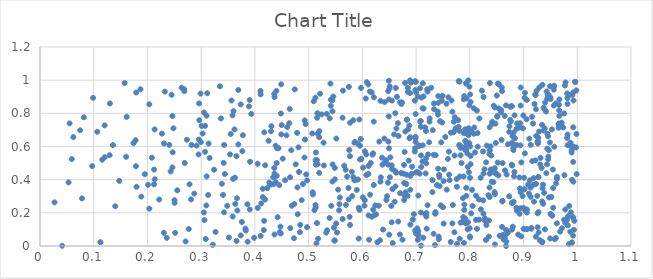
| Category | Series 0 |
|---|---|
| 0.725001586988589 | 0.75 |
| 0.5095330383467418 | 0.873 |
| 0.7491788354854625 | 0.906 |
| 0.9134312972160937 | 0.61 |
| 0.9310733424665492 | 0.492 |
| 0.6560143534649919 | 0.343 |
| 0.7190368506950143 | 0.498 |
| 0.9845870090882262 | 0.911 |
| 0.6255931763452097 | 0.191 |
| 0.6673933461414293 | 0.663 |
| 0.3890036401825033 | 0.842 |
| 0.6200912360928926 | 0.219 |
| 0.9921547678688489 | 0.062 |
| 0.8346472091099474 | 0.307 |
| 0.5662466689041356 | 0.484 |
| 0.6800089196566471 | 0.69 |
| 0.5528158931915826 | 0.082 |
| 0.8005545108075353 | 0.052 |
| 0.9518390606133226 | 0.296 |
| 0.7310391127308724 | 0.699 |
| 0.6111034641791904 | 0.974 |
| 0.9665549706235409 | 0.785 |
| 0.5956875371962214 | 0.522 |
| 0.6062852824526372 | 0.889 |
| 0.8415611706544808 | 0.749 |
| 0.8945519705392241 | 0.847 |
| 0.4267641198110218 | 0.382 |
| 0.678710162588666 | 0.567 |
| 0.7971405302204978 | 0.999 |
| 0.7438169328280968 | 0.361 |
| 0.7958289857257108 | 0.1 |
| 0.6173149417500813 | 0.926 |
| 0.8205073022126326 | 0.221 |
| 0.6982154945142347 | 0.994 |
| 0.943731275735242 | 0.493 |
| 0.7514206920747312 | 0.135 |
| 0.6039256323105225 | 0.243 |
| 0.8733132752875881 | 0.688 |
| 0.6633946385659116 | 0.709 |
| 0.9458343813561789 | 0.523 |
| 0.981980027722871 | 0.672 |
| 0.8533211458474628 | 0.426 |
| 0.7405950172075721 | 0.792 |
| 0.5829296847471984 | 0.759 |
| 0.6902198188301324 | 0.985 |
| 0.43864776500231145 | 0.605 |
| 0.43399823352134453 | 0.414 |
| 0.6241159649386732 | 0.245 |
| 0.6545571291723801 | 0.143 |
| 0.6983613228331528 | 0.093 |
| 0.8832959654660278 | 0.788 |
| 0.611525012192023 | 0.184 |
| 0.13571287727071696 | 0.609 |
| 0.30266792394079706 | 0.678 |
| 0.9363169308590241 | 0.37 |
| 0.8253604861839422 | 0.195 |
| 0.6409233304557433 | 0.648 |
| 0.7568869017094755 | 0.34 |
| 0.10662095809560727 | 0.689 |
| 0.992743163282861 | 0.388 |
| 0.9931301258171383 | 0.599 |
| 0.34846575468630137 | 0.242 |
| 0.1790670955475796 | 0.926 |
| 0.8556414152163271 | 0.062 |
| 0.9709993220737866 | 0.744 |
| 0.3072089882992395 | 0.568 |
| 0.9062636739104442 | 0.22 |
| 0.7222603872724452 | 0.552 |
| 0.9656562011730757 | 0.734 |
| 0.8655307106309384 | 0.456 |
| 0.8074730255357258 | 0.831 |
| 0.7858386160837396 | 0.144 |
| 0.3594037193597853 | 0.405 |
| 0.3776632296586133 | 0.668 |
| 0.9959207697700022 | 0.99 |
| 0.78988442319407 | 0.25 |
| 0.9107584724568967 | 0.647 |
| 0.6314740144409878 | 0.629 |
| 0.36557644256676497 | 0.541 |
| 0.5391310085265107 | 0.77 |
| 0.5755772957528117 | 0.579 |
| 0.8409786779451738 | 0.446 |
| 0.7057101089736312 | 0.605 |
| 0.8957725753057325 | 0.058 |
| 0.46543575665788056 | 0.414 |
| 0.989730248386991 | 0.022 |
| 0.965290960607585 | 0.713 |
| 0.5487737346435798 | 0.033 |
| 0.7402337861110879 | 0.811 |
| 0.5126907212008031 | 0.895 |
| 0.548693879904094 | 0.47 |
| 0.7741254451103736 | 0.711 |
| 0.3100093330466176 | 0.786 |
| 0.24699361122562835 | 0.565 |
| 0.29650849273352414 | 0.759 |
| 0.8948487710447344 | 0.227 |
| 0.7695440100696784 | 0.686 |
| 0.7433957472606513 | 0.416 |
| 0.9781347852374314 | 0.987 |
| 0.27692937525773675 | 0.103 |
| 0.3516072007685348 | 0.051 |
| 0.8900635658901666 | 0.069 |
| 0.8870123314660103 | 0.707 |
| 0.8785750293446377 | 0.099 |
| 0.4464666959652887 | 0.084 |
| 0.8397347959015038 | 0.546 |
| 0.9923152577072112 | 0.507 |
| 0.9061492932446311 | 0.202 |
| 0.9176391766157836 | 0.368 |
| 0.8074626171882762 | 0.677 |
| 0.6818812745742746 | 0.373 |
| 0.6337155295521498 | 0.875 |
| 0.23068939185443207 | 0.08 |
| 0.06209417651011934 | 0.657 |
| 0.5421398710477777 | 0.242 |
| 0.8082098830293012 | 0.715 |
| 0.9818622013563563 | 0.857 |
| 0.853634641552173 | 0.83 |
| 0.7214339374995619 | 0.931 |
| 0.78450967329659 | 0.5 |
| 0.5167265458756984 | 0.493 |
| 0.8600161614069372 | 0.061 |
| 0.7412703577657648 | 0.904 |
| 0.46012452452821756 | 0.717 |
| 0.43064683294624195 | 0.723 |
| 0.8044018136353854 | 0.339 |
| 0.9116183611069647 | 0.396 |
| 0.20342612318622838 | 0.225 |
| 0.4453426356134302 | 0.367 |
| 0.7877848319401499 | 0.174 |
| 0.5478092964358868 | 0.032 |
| 0.8996667359406408 | 0.787 |
| 0.7140016761178428 | 0.829 |
| 0.9979890914602817 | 0.594 |
| 0.6824825290567326 | 0.43 |
| 0.86850145687342 | 0.431 |
| 0.9274148885111936 | 0.652 |
| 0.6975227495425713 | 0.57 |
| 0.944006350456552 | 0.888 |
| 0.7762515259167917 | 0.012 |
| 0.2820720543568918 | 0.609 |
| 0.6337535351821341 | 0.388 |
| 0.9176620868222245 | 0.738 |
| 0.36584395202771575 | 0.03 |
| 0.8114634545417975 | 0.303 |
| 0.5412411720118565 | 0.846 |
| 0.6343732497950182 | 0.414 |
| 0.6873508799585589 | 0.726 |
| 0.8822485434938588 | 0.421 |
| 0.1474351264697906 | 0.393 |
| 0.315630093372424 | 0.531 |
| 0.7123038722516409 | 0.607 |
| 0.4404072794042502 | 0.5 |
| 0.5343518096943621 | 0.095 |
| 0.6495603674491486 | 0.589 |
| 0.33486430272637635 | 0.963 |
| 0.7981341090183545 | 0.609 |
| 0.8371774463389196 | 0.576 |
| 0.6775901144304963 | 0.489 |
| 0.5175993737872184 | 0.044 |
| 0.6512491323387929 | 0.414 |
| 0.8299175707795055 | 0.036 |
| 0.710043146545647 | 0.895 |
| 0.9897242563779457 | 0.019 |
| 0.38594187893291443 | 0.252 |
| 0.8053441779748277 | 0.242 |
| 0.4791859597205306 | 0.353 |
| 0.6841721001446541 | 0.302 |
| 0.7305705724119709 | 0.398 |
| 0.8732145753486052 | 0.3 |
| 0.7591914279855669 | 0.525 |
| 0.5744632661897181 | 0.281 |
| 0.8364861815591774 | 0.555 |
| 0.9738363689347954 | 0.715 |
| 0.8014784947242716 | 0.868 |
| 0.7089910404151487 | 0.202 |
| 0.32673565995606424 | 0.085 |
| 0.3537195237173006 | 0.553 |
| 0.6591986756604169 | 0.673 |
| 0.8460528726784085 | 0.325 |
| 0.44107320615033635 | 0.589 |
| 0.9193184344584736 | 0.267 |
| 0.8707437364715171 | 0.614 |
| 0.8541740039427205 | 0.975 |
| 0.519592207020753 | 0.441 |
| 0.5566682200827316 | 0.215 |
| 0.8248725340165219 | 0.276 |
| 0.6442612674459924 | 0.517 |
| 0.9663743676370914 | 0.817 |
| 0.8131563737572906 | 0.817 |
| 0.9086770701369272 | 0.37 |
| 0.6737414424305784 | 0.865 |
| 0.9870578685874855 | 0.086 |
| 0.5762251297339357 | 0.176 |
| 0.3085302216763091 | 0.043 |
| 0.9350148484669121 | 0.971 |
| 0.7252218452352861 | 0.769 |
| 0.4926111791485709 | 0.757 |
| 0.5130382231637883 | 0.517 |
| 0.7031156600113537 | 0.445 |
| 0.5076005337312521 | 0.324 |
| 0.3073254132688651 | 0.724 |
| 0.7031933554121034 | 0.901 |
| 0.8605196432513519 | 0.269 |
| 0.7125670632050853 | 0.981 |
| 0.7730860412779741 | 0.701 |
| 0.6459760645618189 | 0.3 |
| 0.9501432474127963 | 0.886 |
| 0.49555676489249273 | 0.432 |
| 0.7759431120840116 | 0.357 |
| 0.6044769724878659 | 0.276 |
| 0.8707210346110781 | 0.083 |
| 0.39341630148825724 | 0.796 |
| 0.9394023815162362 | 0.709 |
| 0.6500678019869017 | 0.068 |
| 0.6662193815481648 | 0.741 |
| 0.7954354525864844 | 0.558 |
| 0.8001875021933152 | 0.057 |
| 0.43648516056484865 | 0.069 |
| 0.2080974184994489 | 0.533 |
| 0.28715412716086314 | 0.316 |
| 0.5169063142642852 | 0.677 |
| 0.8255285566318616 | 0.437 |
| 0.654950809192715 | 0.877 |
| 0.3830220496378086 | 0.093 |
| 0.513660331116821 | 0.491 |
| 0.7915177403923752 | 0.166 |
| 0.5932292349238428 | 0.231 |
| 0.9490582789036782 | 0.624 |
| 0.9703779198890298 | 0.731 |
| 0.9811489820432473 | 0.92 |
| 0.8940800965724275 | 0.607 |
| 0.7410816772122133 | 0.466 |
| 0.44389476562699065 | 0.59 |
| 0.563168642784023 | 0.773 |
| 0.8583096203257738 | 0.82 |
| 0.24839549315427553 | 0.71 |
| 0.607307296171147 | 0.428 |
| 0.6792812198083674 | 0.302 |
| 0.8944356611898674 | 0.325 |
| 0.6848948853155751 | 0.703 |
| 0.5971486208776629 | 0.645 |
| 0.7977416355814583 | 0.71 |
| 0.14000129887389684 | 0.24 |
| 0.3619513137721654 | 0.703 |
| 0.9038328223190082 | 0.101 |
| 0.9924914323459438 | 0.926 |
| 0.8812417211535885 | 0.578 |
| 0.6796126635236117 | 0.983 |
| 0.37348887464570024 | 0.854 |
| 0.5277226206881684 | 0.623 |
| 0.9846384153798308 | 0.011 |
| 0.7178415495514808 | 0.437 |
| 0.24321468462907098 | 0.45 |
| 0.5459098220298798 | 0.901 |
| 0.8649656136458619 | 0.784 |
| 0.2684368689385281 | 0.945 |
| 0.7926179891014925 | 0.98 |
| 0.7997597064905245 | 0.107 |
| 0.8916549134459049 | 0.715 |
| 0.3765789618417321 | 0.572 |
| 0.8174863163357039 | 0.159 |
| 0.17851804596823098 | 0.481 |
| 0.9131289246109907 | 0.297 |
| 0.5282757406226397 | 0.486 |
| 0.3904402406046611 | 0.221 |
| 0.6888226383423443 | 0.999 |
| 0.48443825081348607 | 0.127 |
| 0.49432674511029107 | 0.735 |
| 0.7281759730041156 | 0.954 |
| 0.9985854576981191 | 0.675 |
| 0.9501587909222121 | 0.194 |
| 0.4971247727553809 | 0.395 |
| 0.9399048610373488 | 0.1 |
| 0.1870845442723969 | 0.945 |
| 0.7516993207349669 | 0.462 |
| 0.07471523691367417 | 0.698 |
| 0.6081803070062485 | 0.988 |
| 0.5513222087239132 | 0.136 |
| 0.7782663913938279 | 0.759 |
| 0.5932625684387646 | 0.045 |
| 0.9317349719731297 | 0.531 |
| 0.6565293039670159 | 0.018 |
| 0.7334701545154308 | 0.825 |
| 0.8385680286158169 | 0.601 |
| 0.9810665913155583 | 0.652 |
| 0.6552627620350668 | 0.464 |
| 0.6279769730123543 | 0.023 |
| 0.7612224972614668 | 0.569 |
| 0.698924275602623 | 0.652 |
| 0.8177100780293282 | 0.769 |
| 0.8867996543909487 | 0.23 |
| 0.921799720850916 | 0.913 |
| 0.9268421565178121 | 0.632 |
| 0.7413868872311618 | 0.864 |
| 0.4365323676317515 | 0.898 |
| 0.5812769465792557 | 0.301 |
| 0.2505278589417363 | 0.26 |
| 0.661241877241859 | 0.8 |
| 0.8388816448476677 | 0.461 |
| 0.9203614082461797 | 0.856 |
| 0.6986162941856925 | 0.941 |
| 0.6416292740035725 | 0.868 |
| 0.7861349668586449 | 0.144 |
| 0.8923544783225515 | 0.413 |
| 0.46766926133473813 | 0.578 |
| 0.4107414788832621 | 0.061 |
| 0.9925410360336214 | 0.173 |
| 0.2122116386401961 | 0.372 |
| 0.5442299973674956 | 0.879 |
| 0.3096263596587321 | 0.244 |
| 0.5716026182515391 | 0.418 |
| 0.4657847036844907 | 0.108 |
| 0.9418035706467038 | 0.811 |
| 0.1574879257475836 | 0.982 |
| 0.17802882721612207 | 0.638 |
| 0.6644483318168732 | 0.899 |
| 0.8599933134984581 | 0.934 |
| 0.8356314541851044 | 0.154 |
| 0.9280168824392097 | 0.081 |
| 0.8418549850811203 | 0.737 |
| 0.3239351091241988 | 0.46 |
| 0.3665963557284427 | 0.288 |
| 0.6143253809863027 | 0.309 |
| 0.9667910684327236 | 0.884 |
| 0.7982750730119637 | 0.445 |
| 0.3367550488167914 | 0.769 |
| 0.6199737390652874 | 0.559 |
| 0.949876366397647 | 0.897 |
| 0.4290510872859222 | 0.37 |
| 0.7913499553603897 | 0.704 |
| 0.9681761594072074 | 0.087 |
| 0.9019762895886421 | 0.342 |
| 0.7041114982219525 | 0.09 |
| 0.9373660594039211 | 0.834 |
| 0.7356836833415428 | 0.195 |
| 0.7615528764102623 | 0.431 |
| 0.5804371358891192 | 0.448 |
| 0.9267241849711877 | 0.618 |
| 0.5469959723696123 | 0.11 |
| 0.7896728593029748 | 0.218 |
| 0.9429799012496026 | 0.932 |
| 0.33859586294147576 | 0.375 |
| 0.7703812183576753 | 0.749 |
| 0.8580853725829982 | 0.807 |
| 0.6366246476307456 | 0.533 |
| 0.8928039472037902 | 0.194 |
| 0.6699412892170898 | 0.07 |
| 0.9816674464014334 | 0.892 |
| 0.439964103154453 | 0.935 |
| 0.8246831108855038 | 0.57 |
| 0.12051685327315093 | 0.536 |
| 0.8781144684517885 | 0.49 |
| 0.8768605149604672 | 0.843 |
| 0.9033632202245732 | 0.212 |
| 0.36739811587055404 | 0.214 |
| 0.3901705208161291 | 0.88 |
| 0.8308706400639484 | 0.126 |
| 0.2994671878669791 | 0.627 |
| 0.992454734871364 | 0.716 |
| 0.9471373103534642 | 0.578 |
| 0.47421647291520874 | 0.944 |
| 0.6995217235724404 | 0.989 |
| 0.6726248086167748 | 0.856 |
| 0.8606935949202266 | 0.273 |
| 0.6776486975047178 | 0.277 |
| 0.5413111126879026 | 0.882 |
| 0.7675761425009512 | 0.81 |
| 0.9364889056767088 | 0.254 |
| 0.9881313343853437 | 0.203 |
| 0.8937137777623775 | 0.74 |
| 0.8304055992056605 | 0.505 |
| 0.6990065181024343 | 0.628 |
| 0.34190800950337613 | 0.501 |
| 0.5487220870473867 | 0.402 |
| 0.12963495869256822 | 0.547 |
| 0.6628708155487195 | 0.442 |
| 0.7388977765455828 | 0.367 |
| 0.9303876626348231 | 0.035 |
| 0.08159602737187704 | 0.776 |
| 0.31388862498647985 | 0.618 |
| 0.9402498000975565 | 0.865 |
| 0.875150943944139 | 0.761 |
| 0.7914797085272719 | 0.634 |
| 0.5132021331750773 | 0.232 |
| 0.6991877191006238 | 0.796 |
| 0.8590727046344897 | 0.64 |
| 0.6188526553851729 | 0.551 |
| 0.8316099419100547 | 0.605 |
| 0.9495843775804665 | 0.045 |
| 0.24646521148256897 | 0.474 |
| 0.6008654128723485 | 0.294 |
| 0.49698982937184694 | 0.114 |
| 0.5133990608654834 | 0.564 |
| 0.7757655699943474 | 0.404 |
| 0.9601276171374401 | 0.048 |
| 0.7719806847029101 | 0.776 |
| 0.7001553572594206 | 0.074 |
| 0.8788673920428992 | 0.486 |
| 0.9231379971484892 | 0.825 |
| 0.7189943853817429 | 0.531 |
| 0.4165484002879688 | 0.096 |
| 0.6768231470213847 | 0.436 |
| 0.6720970898857909 | 0.44 |
| 0.8675575935401352 | 0.096 |
| 0.9348785747484065 | 0.025 |
| 0.7933282326628723 | 0.351 |
| 0.9423806418783535 | 0.439 |
| 0.5108097627857124 | 0.216 |
| 0.982699187699538 | 0.179 |
| 0.3426619412534212 | 0.609 |
| 0.47336970254618466 | 0.253 |
| 0.41747541085990436 | 0.686 |
| 0.9937521636364455 | 0.098 |
| 0.789141706753479 | 0.018 |
| 0.2961238037677382 | 0.86 |
| 0.5946100158117283 | 0.218 |
| 0.922624756129206 | 0.911 |
| 0.2359442326170827 | 0.049 |
| 0.8764521478918671 | 0.752 |
| 0.5975784946286834 | 0.953 |
| 0.44985716019779487 | 0.729 |
| 0.5442417299525998 | 0.388 |
| 0.41068125907003306 | 0.914 |
| 0.9372366292941343 | 0.697 |
| 0.85951241266572 | 0.956 |
| 0.4146890582292871 | 0.295 |
| 0.20345784977721681 | 0.854 |
| 0.3563783223303482 | 0.877 |
| 0.4727474033132325 | 0.047 |
| 0.6605718800499712 | 0.454 |
| 0.9551914652165133 | 0.231 |
| 0.09712160957559753 | 0.482 |
| 0.4189734485907041 | 0.28 |
| 0.39096742170681026 | 0.508 |
| 0.8446385692407895 | 0.846 |
| 0.9849642205341154 | 0.241 |
| 0.8674714505608706 | 0 |
| 0.8256253722061272 | 0.898 |
| 0.6124797831134198 | 0.038 |
| 0.5772363357950984 | 0.743 |
| 0.244891612509311 | 0.912 |
| 0.12031065503933552 | 0.727 |
| 0.05510900847996336 | 0.739 |
| 0.9456472039020946 | 0.902 |
| 0.7795094397045936 | 0.995 |
| 0.5155012347652596 | 0.138 |
| 0.7183757079041168 | 0.693 |
| 0.7468490070845306 | 0.625 |
| 0.7790600458311793 | 0.719 |
| 0.9777660557118472 | 0.141 |
| 0.9143748587272387 | 0.109 |
| 0.17411357515317988 | 0.62 |
| 0.9003058401119824 | 0.23 |
| 0.9229392116612698 | 0.056 |
| 0.7057132587177265 | 0.604 |
| 0.3425288691485212 | 0.203 |
| 0.2502791102706574 | 0.276 |
| 0.595453582052378 | 0.605 |
| 0.732545252409776 | 0.55 |
| 0.9144219092161183 | 0.104 |
| 0.5549857522804281 | 0.34 |
| 0.6537486724540083 | 0.242 |
| 0.9619422701643466 | 0.136 |
| 0.79317741241004 | 0.136 |
| 0.8809434008009365 | 0.592 |
| 0.8369503052632805 | 0.436 |
| 0.902456166607094 | 0.559 |
| 0.6893959702471137 | 0.423 |
| 0.2307177405472762 | 0.618 |
| 0.6485371684399547 | 0.63 |
| 0.7543126261375096 | 0.657 |
| 0.2951607125352582 | 0.552 |
| 0.847739861589448 | 0.738 |
| 0.8989368329762788 | 0.71 |
| 0.9777123535177198 | 0.22 |
| 0.6446850746602227 | 0.278 |
| 0.7350763623416103 | 0.006 |
| 0.43867930526620896 | 0.385 |
| 0.9824659960355283 | 0.124 |
| 0.8007056545363473 | 0.914 |
| 0.8279771335249192 | 0.167 |
| 0.3757619199443229 | 0.145 |
| 0.8014446904957222 | 0.493 |
| 0.45617175074702193 | 0.397 |
| 0.81331987799695 | 0.104 |
| 0.9059961772141301 | 0.88 |
| 0.344031751723324 | 0.434 |
| 0.3053151127538024 | 0.805 |
| 0.5126795958436711 | 0.247 |
| 0.8756084747082992 | 0.839 |
| 0.744648592135408 | 0.752 |
| 0.7887188676929872 | 0.885 |
| 0.9383088489512913 | 0.32 |
| 0.7091507309594702 | 0.002 |
| 0.732582888978892 | 0.074 |
| 0.5573211379453478 | 0.252 |
| 0.8816397690790431 | 0.267 |
| 0.9622457044722357 | 0.417 |
| 0.7420164523976235 | 0.057 |
| 0.7040808696785379 | 0.304 |
| 0.4360093156678655 | 0.917 |
| 0.5833266937701979 | 0.415 |
| 0.8280002416645676 | 0.154 |
| 0.8616346203465525 | 0.067 |
| 0.5197593573450212 | 0.656 |
| 0.48938539301578654 | 0.374 |
| 0.7479398452227591 | 0.876 |
| 0.8408563172707741 | 0.387 |
| 0.6704083650626749 | 0.867 |
| 0.17967148517827275 | 0.357 |
| 0.3586756083704404 | 0.178 |
| 0.8467953196621795 | 0.009 |
| 0.7092170647344154 | 0.546 |
| 0.7809391527316456 | 0.694 |
| 0.22702246409016813 | 0.677 |
| 0.878135733768124 | 0.621 |
| 0.24072344838790652 | 0.61 |
| 0.6891531593615905 | 0.339 |
| 0.4053001605155314 | 0.229 |
| 0.9653808437158203 | 0.739 |
| 0.9533493071957123 | 0.182 |
| 0.8787291084195821 | 0.261 |
| 0.8872191029455483 | 0.608 |
| 0.5067888086763724 | 0.679 |
| 0.8171074769516504 | 0.281 |
| 0.5154600972876509 | 0.518 |
| 0.7622351328938417 | 0.397 |
| 0.822357895042134 | 0.937 |
| 0.6306338076109136 | 0.243 |
| 0.797291420894935 | 0.669 |
| 0.6999774231361305 | 0.928 |
| 0.9056389512118426 | 0.764 |
| 0.48111455167473427 | 0.595 |
| 0.8839799031685239 | 0.65 |
| 0.7087020235688607 | 0.754 |
| 0.9606791414571301 | 0.378 |
| 0.7206950679849105 | 0.945 |
| 0.9335558008098966 | 0.471 |
| 0.7932683126925271 | 0.302 |
| 0.8487162273105222 | 0.439 |
| 0.1952178742442458 | 0.433 |
| 0.42305164389826344 | 0.349 |
| 0.8799715377316335 | 0.116 |
| 0.6747425626374188 | 0.038 |
| 0.3549400187957028 | 0.675 |
| 0.9188074334749973 | 0.409 |
| 0.8737683795715944 | 0.722 |
| 0.7995291315211789 | 0.687 |
| 0.59819089040399 | 0.525 |
| 0.7486565110937732 | 0.745 |
| 0.9222393036742467 | 0.516 |
| 0.362793364823403 | 0.412 |
| 0.5198307537571468 | 0.693 |
| 0.05320483930085307 | 0.383 |
| 0.7360434160791984 | 0.204 |
| 0.9279063247731907 | 0.416 |
| 0.31292356226759865 | 0.307 |
| 0.5338141317439075 | 0.797 |
| 0.7809995222367154 | 0.991 |
| 0.44068070370962054 | 0.423 |
| 0.4796477433496006 | 0.191 |
| 0.924191721452505 | 0.935 |
| 0.6887445997096432 | 0.922 |
| 0.9347327290416345 | 0.269 |
| 0.2710174642589631 | 0.028 |
| 0.4104295187599538 | 0.935 |
| 0.9021391700562214 | 0.893 |
| 0.6940654416593975 | 0.159 |
| 0.6228104273356425 | 0.186 |
| 0.648148331984438 | 0.934 |
| 0.695870385024705 | 0.192 |
| 0.30615335893110446 | 0.156 |
| 0.686386080215699 | 0.515 |
| 0.8647442330872736 | 0.061 |
| 0.6890516558609951 | 0.656 |
| 0.661660782669213 | 0.359 |
| 0.6211656766421005 | 0.75 |
| 0.670354831658966 | 0.318 |
| 0.6601693045694557 | 0.267 |
| 0.6072476145324487 | 0.552 |
| 0.4483694269083889 | 0.799 |
| 0.9260831164304424 | 0.627 |
| 0.16128428629709657 | 0.779 |
| 0.09875062398718246 | 0.893 |
| 0.7872100829220974 | 0.289 |
| 0.5694274989821559 | 0.248 |
| 0.6374336366549006 | 0.49 |
| 0.8483559799254532 | 0.621 |
| 0.9262542335584818 | 0.197 |
| 0.20107833423683064 | 0.369 |
| 0.7853063375458583 | 0.597 |
| 0.5866292448613695 | 0.398 |
| 0.44755743295597694 | 0.117 |
| 0.8468561494116325 | 0.313 |
| 0.9580948339910056 | 0.041 |
| 0.18858827417619706 | 0.298 |
| 0.9563289801760365 | 0.847 |
| 0.6545227748484468 | 0.486 |
| 0.5915945932429715 | 0.618 |
| 0.9130431008849049 | 0.352 |
| 0.8272440237368952 | 0.463 |
| 0.8509901915472655 | 0.783 |
| 0.9528100135549326 | 0.703 |
| 0.7364644258202475 | 0.548 |
| 0.8520651218082411 | 0.98 |
| 0.8373783329583491 | 0.983 |
| 0.9564589968359494 | 0.96 |
| 0.5918398876730644 | 0.401 |
| 0.925535033350669 | 0.302 |
| 0.9549884684087869 | 0.349 |
| 0.8959001225288757 | 0.504 |
| 0.9291212269967069 | 0.69 |
| 0.6047105574022866 | 0.571 |
| 0.992038410745065 | 0.171 |
| 0.57710782493431 | 0.127 |
| 0.8649893710483968 | 0.048 |
| 0.24635951002805567 | 0.784 |
| 0.6522128684172595 | 0.535 |
| 0.49226430285137873 | 0.534 |
| 0.6492549703749 | 0.883 |
| 0.6328235172820899 | 0.035 |
| 0.9546434153464103 | 0.461 |
| 0.9989458230311457 | 0.434 |
| 0.2554691880620022 | 0.336 |
| 0.9343447027327002 | 0.731 |
| 0.9461804479714057 | 0.539 |
| 0.7649014802734695 | 0.683 |
| 0.5389514738176291 | 0.169 |
| 0.8629033963515117 | 0.04 |
| 0.4820912406775043 | 0.446 |
| 0.7031377252643132 | 0.037 |
| 0.971521417559598 | 0.107 |
| 0.2685814439553062 | 0.934 |
| 0.5741964503213256 | 0.35 |
| 0.9455437037023228 | 0.662 |
| 0.38233285565416464 | 0.105 |
| 0.742258834225133 | 0.041 |
| 0.9930111535988245 | 0.878 |
| 0.44804393460232356 | 0.075 |
| 0.5769571481296035 | 0.542 |
| 0.29129543653392026 | 0.606 |
| 0.3216515724319662 | 0.007 |
| 0.9000827580715247 | 0.104 |
| 0.21357374581045896 | 0.402 |
| 0.16028753467931955 | 0.538 |
| 0.8144938473200592 | 0.681 |
| 0.7168620429994639 | 0.715 |
| 0.9292474412265055 | 0.955 |
| 0.7138037493286347 | 0.902 |
| 0.3864616780751206 | 0.026 |
| 0.8200961314287953 | 0.412 |
| 0.7565179860046898 | 0.858 |
| 0.801602518984043 | 0.543 |
| 0.5144327599263651 | 0.016 |
| 0.9760605761201723 | 0.427 |
| 0.8465262882169731 | 0.47 |
| 0.8006507452781307 | 0.602 |
| 0.3736408222756495 | 0.063 |
| 0.05921165317578764 | 0.524 |
| 0.9445642212265678 | 0.675 |
| 0.7242998990824032 | 0.626 |
| 0.31016276369992346 | 0.42 |
| 0.6921289424538413 | 0.436 |
| 0.9026678495705355 | 0.924 |
| 0.041298199907328234 | 0.001 |
| 0.699964628074218 | 0.444 |
| 0.2735161316225332 | 0.641 |
| 0.5079223224031472 | 0.311 |
| 0.45178049467181775 | 0.527 |
| 0.49329026331430975 | 0.642 |
| 0.6155310885440202 | 0.501 |
| 0.5580378165668646 | 0.293 |
| 0.4489346122939361 | 0.975 |
| 0.23235906006645554 | 0.931 |
| 0.5852627287495962 | 0.396 |
| 0.7022405954872727 | 0.106 |
| 0.5444306044073334 | 0.812 |
| 0.8675138565372943 | 0.848 |
| 0.9567410316178081 | 0.967 |
| 0.9621603931609488 | 0.404 |
| 0.6668078437416584 | 0.148 |
| 0.9895119604183625 | 0.564 |
| 0.7811553986183797 | 0.044 |
| 0.8830487601240375 | 0.447 |
| 0.8795527237059435 | 0.663 |
| 0.6777573646260411 | 0.38 |
| 0.9752670300876688 | 0.799 |
| 0.4050325513122857 | 0.496 |
| 0.6139528377780646 | 0.932 |
| 0.6115025751462934 | 0.483 |
| 0.8095742859077341 | 0.564 |
| 0.6476676274688569 | 0.382 |
| 0.8464155086630273 | 0.836 |
| 0.7993926038957223 | 0.961 |
| 0.47594459826692487 | 0.493 |
| 0.9962962662016481 | 0.99 |
| 0.7930316757521724 | 0.599 |
| 0.8609885376524152 | 0.5 |
| 0.48373173848833373 | 0.083 |
| 0.8492587851273129 | 0.433 |
| 0.5633019446334663 | 0.163 |
| 0.9392307509570373 | 0.823 |
| 0.9908078499691989 | 0.911 |
| 0.5863445968945689 | 0.628 |
| 0.7196678043879676 | 0.104 |
| 0.621556019626994 | 0.897 |
| 0.42991954404784744 | 0.692 |
| 0.2988858707802562 | 0.919 |
| 0.8369137594391616 | 0.716 |
| 0.4640839078716306 | 0.741 |
| 0.13006018826754348 | 0.86 |
| 0.4686874493731787 | 0.242 |
| 0.5445561163816357 | 0.492 |
| 0.281249525793895 | 0.281 |
| 0.8877205229354117 | 0.213 |
| 0.6828041485744775 | 0.761 |
| 0.7332000217497001 | 0.86 |
| 0.5688837202988354 | 0.46 |
| 0.7068240158122057 | 0.437 |
| 0.6875474222514576 | 0.649 |
| 0.7511957415896927 | 0.391 |
| 0.7119298086522469 | 0.51 |
| 0.7824492801020568 | 0.592 |
| 0.5163077630196407 | 0.801 |
| 0.9983732641377586 | 0.938 |
| 0.6893510619303166 | 0.129 |
| 0.4422892025021476 | 0.174 |
| 0.9448971867211261 | 0.916 |
| 0.8518863024196022 | 0.503 |
| 0.7961562636961663 | 0.477 |
| 0.3048664842528853 | 0.202 |
| 0.7931092778248197 | 0.579 |
| 0.7992276766424344 | 0.849 |
| 0.9441922680687505 | 0.588 |
| 0.8501532120309421 | 0.907 |
| 0.7428245381275181 | 0.429 |
| 0.9158197554252545 | 0.779 |
| 0.8697458669456133 | 0.078 |
| 0.6848002449275001 | 0.953 |
| 0.9770402962635336 | 0.967 |
| 0.9754082861396925 | 0.159 |
| 0.8438886229719016 | 0.385 |
| 0.22192469010223823 | 0.28 |
| 0.295720507609843 | 0.642 |
| 0.7965973265268027 | 0.144 |
| 0.11243896340364848 | 0.023 |
| 0.5159108023082906 | 0.773 |
| 0.2695144723073746 | 0.501 |
| 0.7168303519129996 | 0.193 |
| 0.5406287842202794 | 0.979 |
| 0.39847061025969976 | 0.049 |
| 0.6386383332336261 | 0.099 |
| 0.21235291982712154 | 0.461 |
| 0.42552661909983314 | 0.634 |
| 0.7812355270102016 | 0.419 |
| 0.6803415281716774 | 0.324 |
| 0.6504465250588406 | 0.949 |
| 0.621200619170086 | 0.368 |
| 0.3009503797477101 | 0.724 |
| 0.6981578686268779 | 0.589 |
| 0.765980415565329 | 0.878 |
| 0.3691584498079992 | 0.941 |
| 0.7685294988536522 | 0.247 |
| 0.6508779614723212 | 0.963 |
| 0.8812954592736009 | 0.613 |
| 0.3112297082938004 | 0.921 |
| 0.7713098926289472 | 0.083 |
| 0.8880541062592932 | 0.739 |
| 0.9270544614107132 | 0.416 |
| 0.7907434713587846 | 0.582 |
| 0.8679392748203323 | 0.027 |
| 0.835579796963575 | 0.057 |
| 0.5639112772952256 | 0.937 |
| 0.966020803180188 | 0.852 |
| 0.7359035628186908 | 0.196 |
| 0.5515783235994433 | 0.648 |
| 0.5242015328441632 | 0.794 |
| 0.7501501112800085 | 0.234 |
| 0.5897016846571842 | 0.338 |
| 0.684630399467837 | 0.929 |
| 0.7134458652026882 | 0.05 |
| 0.900896589685425 | 0.412 |
| 0.027016539600694958 | 0.263 |
| 0.9277890348590243 | 0.204 |
| 0.8367236944451268 | 0.353 |
| 0.8982502439324683 | 0.301 |
| 0.7457658422984716 | 0.245 |
| 0.6491433659249486 | 0.781 |
| 0.6113389527496508 | 0.434 |
| 0.994479267588263 | 0.152 |
| 0.3601653336184035 | 0.813 |
| 0.8513083047137027 | 0.78 |
| 0.4586730733793466 | 0.667 |
| 0.8114774198859966 | 0.157 |
| 0.6176630409122467 | 0.176 |
| 0.5853134112937378 | 0.623 |
| 0.594310667646386 | 0.763 |
| 0.9807914772097713 | 0.157 |
| 0.6483570684543487 | 0.49 |
| 0.7885015180829936 | 0.419 |
| 0.7213705812342128 | 0.246 |
| 0.6492030135101624 | 0.996 |
| 0.7675389692981112 | 0.136 |
| 0.6622595292809624 | 0.953 |
| 0.9492723737204765 | 0.964 |
| 0.8025884812911613 | 0.197 |
| 0.4364112575806073 | 0.437 |
| 0.3633744953786038 | 0.254 |
| 0.9465918033061912 | 0.911 |
| 0.7077510872563054 | 0.751 |
| 0.859943341464943 | 0.115 |
| 0.8147402071848829 | 0.599 |
| 0.9099713000691203 | 0.316 |
| 0.07820481080327579 | 0.287 |
| 0.8816935168767515 | 0.684 |
| 0.6014726643744469 | 0.473 |
| 0.41176333102389123 | 0.256 |
| 0.34068276097342026 | 0.308 |
| 0.878597797024615 | 0.258 |
| 0.8829502386125451 | 0.649 |
| 0.987432925487502 | 0.624 |
| 0.7803049897823285 | 0.61 |
| 0.7305267614796657 | 0.325 |
| 0.26361132631516543 | 0.955 |
| 0.2516074609470412 | 0.079 |
| 0.7939621772428792 | 0.89 |
| 0.7941291382057167 | 0.618 |
| 0.36919741579447235 | 0.612 |
| 0.9347102044711363 | 0.022 |
| 0.9231785610612039 | 0.374 |
| 0.7716002022480581 | 0.545 |
| 0.7047147075892061 | 0.064 |
| 0.6406305078387782 | 0.501 |
| 0.782917862471862 | 0.141 |
| 0.8946952993217783 | 0.956 |
| 0.4190274131299725 | 0.487 |
| 0.5214321038764572 | 0.918 |
| 0.9887043705109385 | 0.601 |
| 0.9562060840861879 | 0.943 |
| 0.464771420494801 | 0.827 |
| 0.6978262145888693 | 0.877 |
| 0.760184006768457 | 0.897 |
| 0.4349170975034703 | 0.373 |
| 0.47852913101063405 | 0.682 |
| 0.7894109860132874 | 0.68 |
| 0.800361014240329 | 0.411 |
| 0.9819831049369514 | 0.608 |
| 0.21332725219669646 | 0.703 |
| 0.9235729225587033 | 0.663 |
| 0.8784697226569157 | 0.843 |
| 0.7120713983352546 | 0.83 |
| 0.8399922051250504 | 0.459 |
| 0.9067144342967811 | 0.102 |
| 0.7991189647592819 | 0.62 |
| 0.9161319677754957 | 0.512 |
| 0.9262010886898652 | 0.113 |
| 0.8369831485751424 | 0.295 |
| 0.9473673717599244 | 0.293 |
| 0.6830545908505821 | 0.762 |
| 0.8930921563754879 | 0.347 |
| 0.7192224333216377 | 0.198 |
| 0.3583604582073029 | 0.788 |
| 0.9598041823552677 | 0.86 |
| 0.709578179697453 | 0.477 |
| 0.5748941022025467 | 0.959 |
| 0.7075030974143771 | 0.951 |
| 0.7645509913977113 | 0.024 |
| 0.9572401729304344 | 0.598 |
| 0.11588380117475368 | 0.52 |
| 0.48709804110810023 | 0.276 |
| 0.8024750077198975 | 0.691 |
| 0.7895859472213886 | 0.904 |
| 0.41472677542882996 | 0.345 |
| 0.7090175198734366 | 0.718 |
| 0.4359878998805012 | 0.471 |
| 0.6988387777099976 | 0.659 |
| 0.9894399632456483 | 0.576 |
| 0.27833621436940076 | 0.372 |
| 0.7190710750243341 | 0.177 |
| 0.9354368147337151 | 0.349 |
| 0.4490588799474387 | 0.673 |
| 0.5327456207000008 | 0.081 |
| 0.4171104472853728 | 0.152 |
| 0.9902313908587216 | 0.399 |
| 0.782869035689629 | 0.547 |
| 0.6925423175629664 | 0.478 |